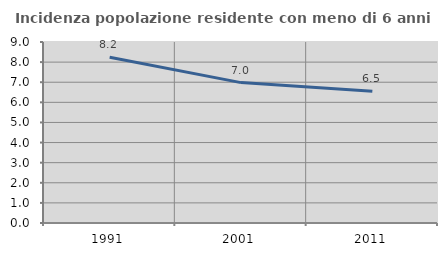
| Category | Incidenza popolazione residente con meno di 6 anni |
|---|---|
| 1991.0 | 8.244 |
| 2001.0 | 6.981 |
| 2011.0 | 6.546 |